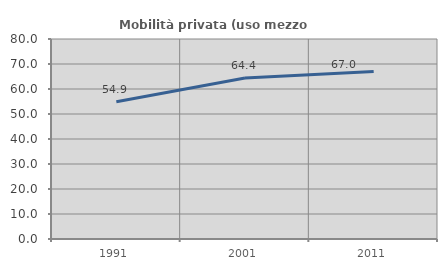
| Category | Mobilità privata (uso mezzo privato) |
|---|---|
| 1991.0 | 54.913 |
| 2001.0 | 64.406 |
| 2011.0 | 66.979 |